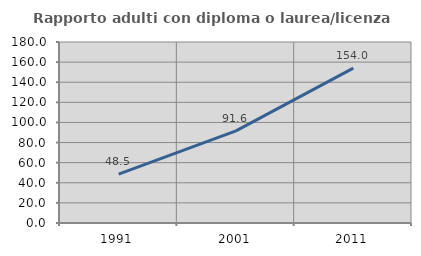
| Category | Rapporto adulti con diploma o laurea/licenza media  |
|---|---|
| 1991.0 | 48.533 |
| 2001.0 | 91.622 |
| 2011.0 | 153.991 |